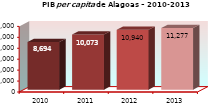
| Category | PIB per capita R$ 1,00 |
|---|---|
| 2010.0 | 8694.498 |
| 2011.0 | 10073.122 |
| 2012.0 | 10940.189 |
| 2013.0 | 11276.586 |